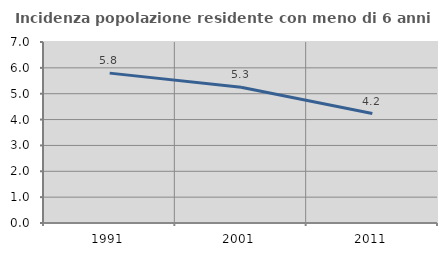
| Category | Incidenza popolazione residente con meno di 6 anni |
|---|---|
| 1991.0 | 5.796 |
| 2001.0 | 5.25 |
| 2011.0 | 4.232 |